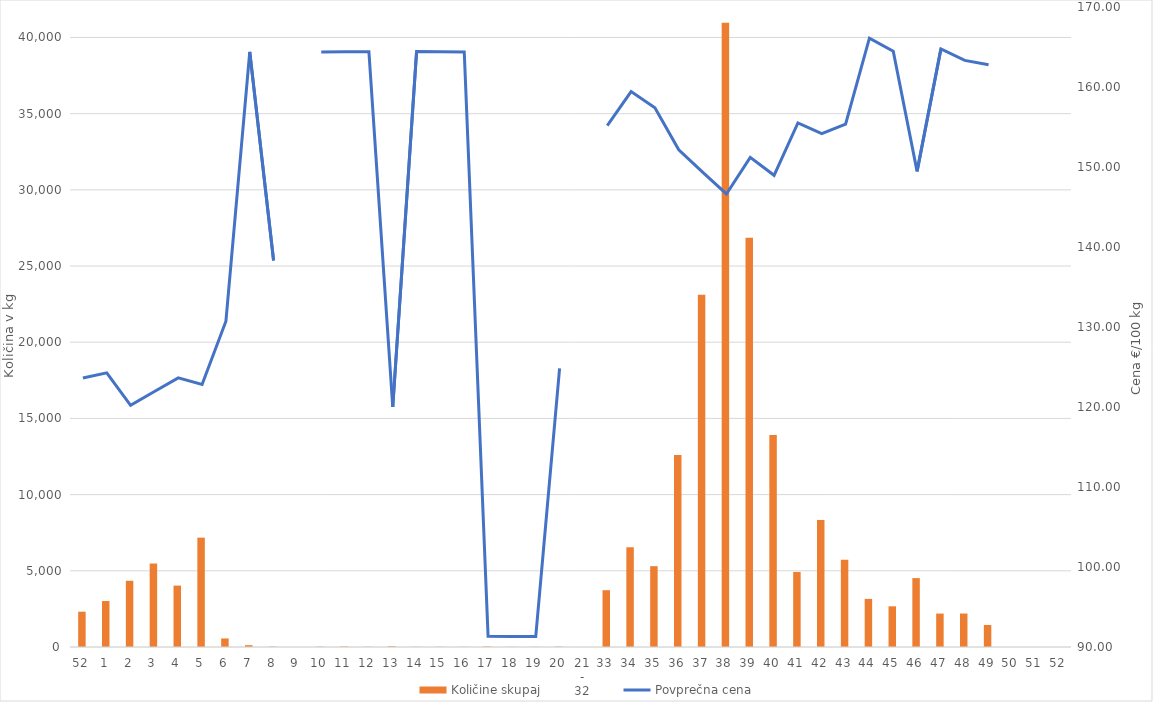
| Category | Količine skupaj |
|---|---|
| 52 | 2316 |
| 1 | 3016 |
| 2 | 4345 |
| 3 | 5478 |
| 4 | 4029 |
| 5 | 7176 |
| 6 | 562 |
| 7 | 119 |
| 8 | 28 |
| 9 | 0 |
| 10 | 21 |
| 11 | 33 |
| 12 | 14 |
| 13 | 50 |
| 14 | 12 |
| 15 | 14 |
| 16 | 12 |
| 17 | 36 |
| 18 | 11 |
| 19 | 12 |
| 20 | 24 |
| 21 - 32 | 0 |
| 33 | 3728 |
| 34 | 6545 |
| 35 | 5305 |
| 36 | 12607 |
| 37 | 23119 |
| 38 | 40968 |
| 39 | 26852 |
| 40 | 13916 |
| 41 | 4927 |
| 42 | 8337 |
| 43 | 5719 |
| 44 | 3157 |
| 45 | 2670 |
| 46 | 4520 |
| 47 | 2194 |
| 48 | 2197 |
| 49 | 1443 |
| 50 | 0 |
| 51 | 0 |
| 52 | 0 |